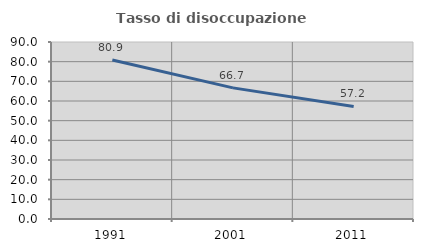
| Category | Tasso di disoccupazione giovanile  |
|---|---|
| 1991.0 | 80.856 |
| 2001.0 | 66.667 |
| 2011.0 | 57.233 |